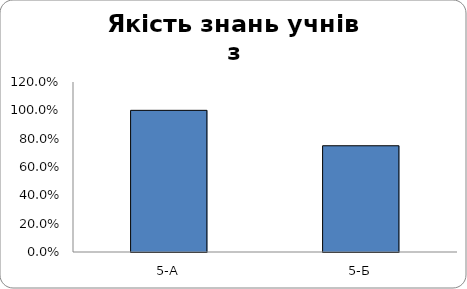
| Category | Series 0 |
|---|---|
| 5-А | 1 |
| 5-Б | 0.75 |